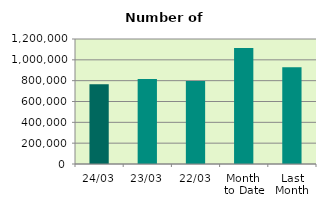
| Category | Series 0 |
|---|---|
| 24/03 | 765428 |
| 23/03 | 816202 |
| 22/03 | 797876 |
| Month 
to Date | 1113460 |
| Last
Month | 928647.7 |